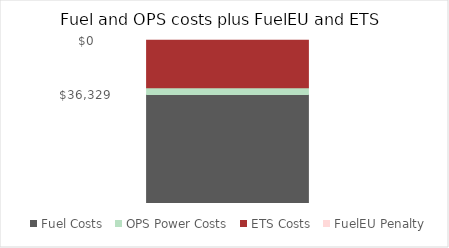
| Category | Fuel Costs | OPS Power Costs | ETS Costs | FuelEU Penalty |
|---|---|---|---|---|
| 0 | 602520.492 | 36328.576 | 263619.08 | 0 |